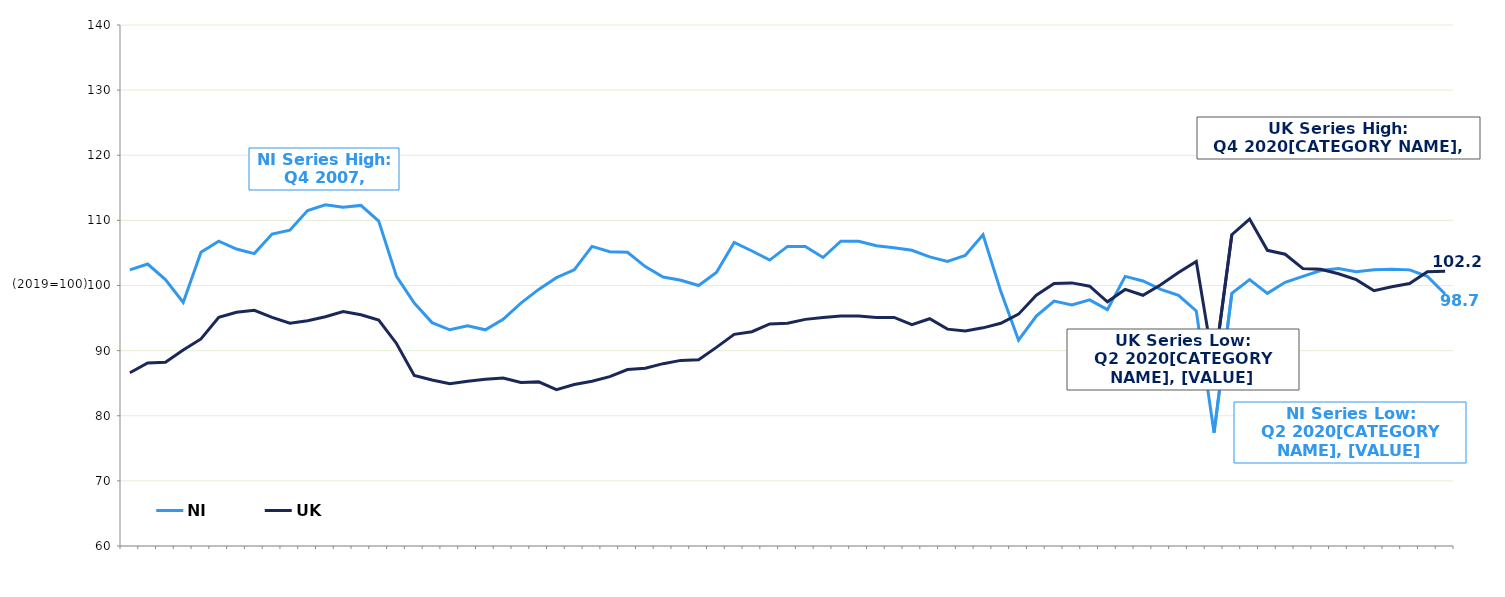
| Category | NI | UK  |
|---|---|---|
|  | 102.4 | 86.6 |
|  | 103.3 | 88.1 |
| Q3 2005 | 100.9 | 88.2 |
|  | 97.4 | 90.1 |
|  | 105.1 | 91.8 |
|  | 106.8 | 95.1 |
| Q3 2006 | 105.6 | 95.9 |
|  | 104.9 | 96.2 |
|  | 107.9 | 95.1 |
|  | 108.5 | 94.2 |
| Q3 2007 | 111.5 | 94.6 |
|  | 112.4 | 95.2 |
|  | 112 | 96 |
|  | 112.3 | 95.5 |
| Q3 2008 | 109.9 | 94.7 |
|  | 101.4 | 91.1 |
|  | 97.3 | 86.2 |
|  | 94.3 | 85.5 |
| Q3 2009 | 93.2 | 84.9 |
|  | 93.8 | 85.3 |
|  | 93.2 | 85.6 |
|  | 94.8 | 85.8 |
| Q3 2010 | 97.3 | 85.1 |
|  | 99.4 | 85.2 |
|  | 101.2 | 84 |
|  | 102.4 | 84.8 |
| Q3 2011 | 106 | 85.3 |
|  | 105.2 | 86 |
|  | 105.1 | 87.1 |
|  | 102.9 | 87.3 |
| Q3 2012 | 101.3 | 88 |
|  | 100.8 | 88.5 |
|  | 100 | 88.6 |
|  | 102 | 90.5 |
| Q3 2013 | 106.6 | 92.5 |
|  | 105.3 | 92.9 |
|  | 103.9 | 94.1 |
|  | 106 | 94.2 |
| Q3 2014 | 106 | 94.8 |
|  | 104.3 | 95.1 |
|  | 106.8 | 95.3 |
|  | 106.8 | 95.3 |
| Q3 2015 | 106.1 | 95.1 |
|  | 105.8 | 95.1 |
|  | 105.4 | 94 |
|  | 104.4 | 94.9 |
| Q3 2016 | 103.7 | 93.3 |
|  | 104.6 | 93 |
|  | 107.8 | 93.5 |
|  | 99.1 | 94.2 |
| Q3 2017 | 91.6 | 95.6 |
|  | 95.3 | 98.5 |
|  | 97.6 | 100.3 |
|  | 97 | 100.4 |
| Q3 2018 | 97.8 | 99.9 |
|  | 96.3 | 97.5 |
|  | 101.4 | 99.4 |
|  | 100.7 | 98.5 |
| Q3 2019 | 99.4 | 100.1 |
|  | 98.5 | 102 |
|  | 96.1 | 103.7 |
|  | 77.4 | 87.3 |
| Q3 2020 | 98.8 | 107.8 |
|  | 100.9 | 110.2 |
|  | 98.8 | 105.4 |
|  | 100.5 | 104.8 |
| Q3 2021 | 101.4 | 102.6 |
|  | 102.3 | 102.5 |
|  | 102.6 | 101.8 |
|  | 102.1 | 100.9 |
| Q3 2022 | 102.4 | 99.2 |
|  | 102.5 | 99.8 |
|  | 102.4 | 100.3 |
|  | 101.4 | 102.1 |
| Q3 2023 | 98.7 | 102.2 |